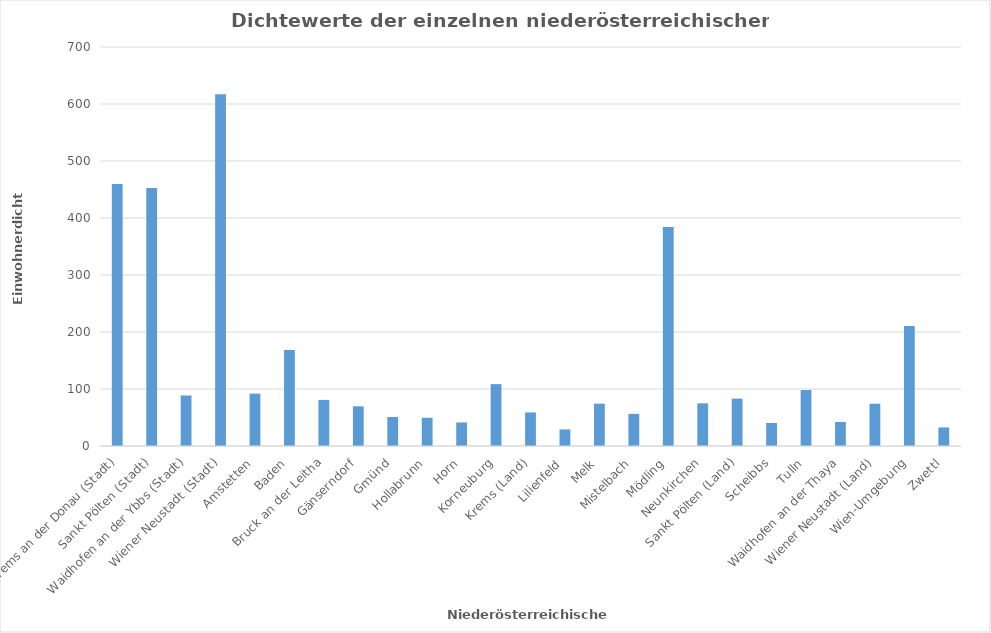
| Category | Series 0 |
|---|---|
| Krems an der Donau (Stadt) | 459.465 |
| Sankt Pölten (Stadt) | 452.603 |
| Waidhofen an der Ybbs (Stadt) | 88.637 |
| Wiener Neustadt (Stadt) | 617.14 |
| Amstetten | 91.907 |
| Baden | 168.433 |
|  Bruck an der Leitha | 80.828 |
| Gänserndorf | 69.594 |
| Gmünd | 50.939 |
| Hollabrunn | 49.539 |
| Horn | 41.327 |
| Korneuburg | 108.509 |
| Krems (Land) | 58.885 |
| Lilienfeld | 29.074 |
| Melk | 74.275 |
| Mistelbach | 56.32 |
| Mödling | 383.994 |
| Neunkirchen | 74.819 |
| Sankt Pölten (Land) | 83.192 |
| Scheibbs | 40.38 |
| Tulln | 98.172 |
| Waidhofen an der Thaya | 42.139 |
| Wiener Neustadt (Land) | 74.154 |
| Wien-Umgebung | 210.531 |
| Zwettl | 32.602 |